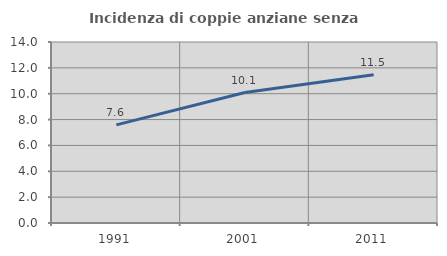
| Category | Incidenza di coppie anziane senza figli  |
|---|---|
| 1991.0 | 7.588 |
| 2001.0 | 10.094 |
| 2011.0 | 11.469 |